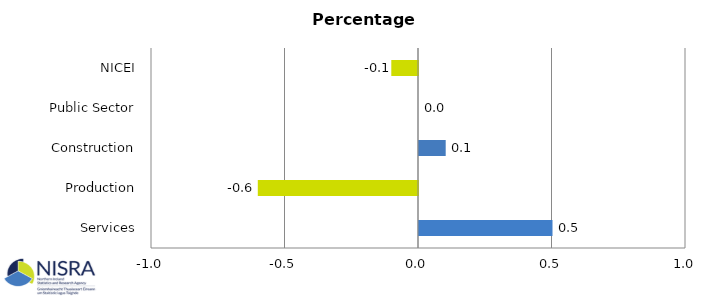
| Category | Percentage Points |
|---|---|
| Services | 0.5 |
| Production | -0.6 |
| Construction | 0.1 |
| Public Sector | 0 |
| NICEI | -0.1 |